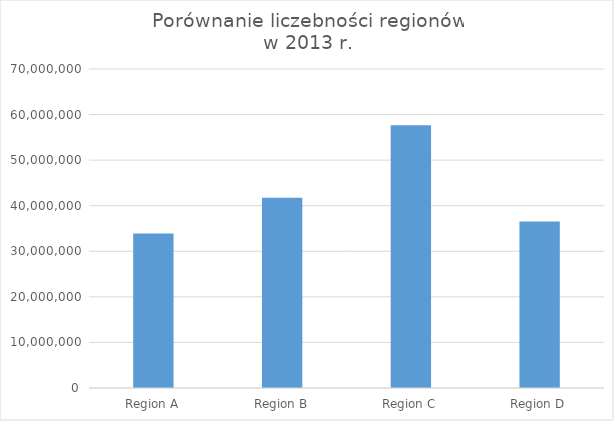
| Category | Series 0 |
|---|---|
| Region A | 33929579 |
| Region B | 41736619 |
| Region C | 57649017 |
| Region D | 36530387 |